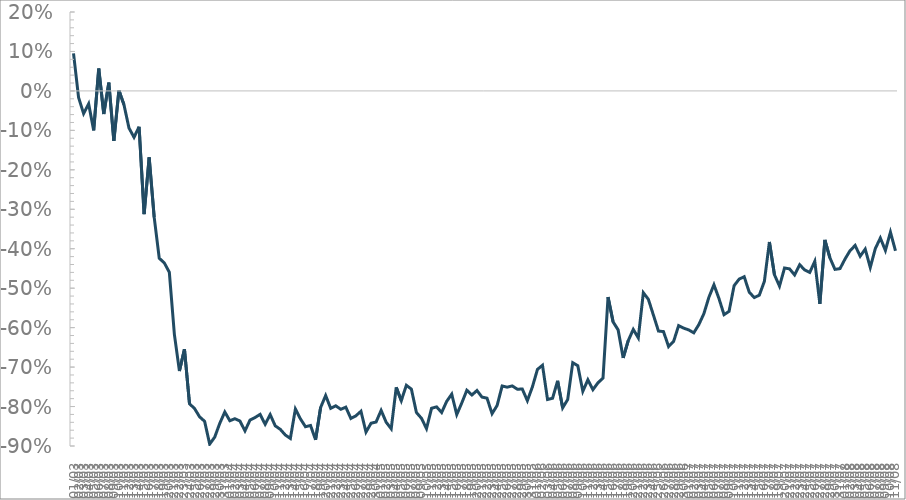
| Category | Series 0 |
|---|---|
| 2020-03-01 | 0.095 |
| 2020-03-02 | -0.017 |
| 2020-03-03 | -0.058 |
| 2020-03-04 | -0.033 |
| 2020-03-05 | -0.1 |
| 2020-03-06 | 0.057 |
| 2020-03-07 | -0.058 |
| 2020-03-08 | 0.021 |
| 2020-03-09 | -0.126 |
| 2020-03-10 | 0.001 |
| 2020-03-11 | -0.035 |
| 2020-03-12 | -0.094 |
| 2020-03-13 | -0.118 |
| 2020-03-14 | -0.091 |
| 2020-03-15 | -0.312 |
| 2020-03-16 | -0.168 |
| 2020-03-17 | -0.321 |
| 2020-03-18 | -0.424 |
| 2020-03-19 | -0.436 |
| 2020-03-20 | -0.46 |
| 2020-03-21 | -0.617 |
| 2020-03-22 | -0.71 |
| 2020-03-23 | -0.655 |
| 2020-03-24 | -0.793 |
| 2020-03-25 | -0.805 |
| 2020-03-26 | -0.826 |
| 2020-03-27 | -0.838 |
| 2020-03-28 | -0.895 |
| 2020-03-29 | -0.878 |
| 2020-03-30 | -0.843 |
| 2020-03-31 | -0.814 |
| 2020-04-01 | -0.836 |
| 2020-04-02 | -0.831 |
| 2020-04-03 | -0.837 |
| 2020-04-04 | -0.862 |
| 2020-04-05 | -0.834 |
| 2020-04-06 | -0.828 |
| 2020-04-07 | -0.82 |
| 2020-04-08 | -0.845 |
| 2020-04-09 | -0.82 |
| 2020-04-10 | -0.849 |
| 2020-04-11 | -0.858 |
| 2020-04-12 | -0.872 |
| 2020-04-13 | -0.881 |
| 2020-04-14 | -0.806 |
| 2020-04-15 | -0.831 |
| 2020-04-16 | -0.851 |
| 2020-04-17 | -0.848 |
| 2020-04-18 | -0.884 |
| 2020-04-19 | -0.802 |
| 2020-04-20 | -0.772 |
| 2020-04-21 | -0.805 |
| 2020-04-22 | -0.798 |
| 2020-04-23 | -0.807 |
| 2020-04-24 | -0.802 |
| 2020-04-25 | -0.83 |
| 2020-04-26 | -0.823 |
| 2020-04-27 | -0.812 |
| 2020-04-28 | -0.865 |
| 2020-04-29 | -0.842 |
| 2020-04-30 | -0.839 |
| 2020-05-01 | -0.81 |
| 2020-05-02 | -0.84 |
| 2020-05-03 | -0.856 |
| 2020-05-04 | -0.751 |
| 2020-05-05 | -0.785 |
| 2020-05-06 | -0.746 |
| 2020-05-07 | -0.756 |
| 2020-05-08 | -0.815 |
| 2020-05-09 | -0.83 |
| 2020-05-10 | -0.856 |
| 2020-05-11 | -0.804 |
| 2020-05-12 | -0.801 |
| 2020-05-13 | -0.815 |
| 2020-05-14 | -0.787 |
| 2020-05-15 | -0.769 |
| 2020-05-16 | -0.82 |
| 2020-05-17 | -0.791 |
| 2020-05-18 | -0.759 |
| 2020-05-19 | -0.771 |
| 2020-05-20 | -0.759 |
| 2020-05-21 | -0.776 |
| 2020-05-22 | -0.779 |
| 2020-05-23 | -0.818 |
| 2020-05-24 | -0.797 |
| 2020-05-25 | -0.748 |
| 2020-05-26 | -0.751 |
| 2020-05-27 | -0.748 |
| 2020-05-28 | -0.756 |
| 2020-05-29 | -0.756 |
| 2020-05-30 | -0.785 |
| 2020-05-31 | -0.75 |
| 2020-06-01 | -0.706 |
| 2020-06-02 | -0.695 |
| 2020-06-03 | -0.782 |
| 2020-06-04 | -0.779 |
| 2020-06-05 | -0.735 |
| 2020-06-06 | -0.803 |
| 2020-06-07 | -0.782 |
| 2020-06-08 | -0.689 |
| 2020-06-09 | -0.696 |
| 2020-06-10 | -0.761 |
| 2020-06-11 | -0.732 |
| 2020-06-12 | -0.757 |
| 2020-06-13 | -0.74 |
| 2020-06-14 | -0.728 |
| 2020-06-15 | -0.523 |
| 2020-06-16 | -0.585 |
| 2020-06-17 | -0.606 |
| 2020-06-18 | -0.677 |
| 2020-06-19 | -0.633 |
| 2020-06-20 | -0.604 |
| 2020-06-21 | -0.626 |
| 2020-06-22 | -0.511 |
| 2020-06-23 | -0.528 |
| 2020-06-24 | -0.568 |
| 2020-06-25 | -0.609 |
| 2020-06-26 | -0.61 |
| 2020-06-27 | -0.648 |
| 2020-06-28 | -0.635 |
| 2020-06-29 | -0.595 |
| 2020-06-30 | -0.601 |
| 2020-07-01 | -0.606 |
| 2020-07-02 | -0.613 |
| 2020-07-03 | -0.592 |
| 2020-07-04 | -0.565 |
| 2020-07-05 | -0.523 |
| 2020-07-06 | -0.491 |
| 2020-07-07 | -0.526 |
| 2020-07-08 | -0.567 |
| 2020-07-09 | -0.559 |
| 2020-07-10 | -0.494 |
| 2020-07-11 | -0.477 |
| 2020-07-12 | -0.471 |
| 2020-07-13 | -0.51 |
| 2020-07-14 | -0.524 |
| 2020-07-15 | -0.518 |
| 2020-07-16 | -0.483 |
| 2020-07-17 | -0.383 |
| 2020-07-18 | -0.466 |
| 2020-07-19 | -0.495 |
| 2020-07-20 | -0.449 |
| 2020-07-21 | -0.451 |
| 2020-07-22 | -0.467 |
| 2020-07-23 | -0.44 |
| 2020-07-24 | -0.454 |
| 2020-07-25 | -0.46 |
| 2020-07-26 | -0.432 |
| 2020-07-27 | -0.54 |
| 2020-07-28 | -0.378 |
| 2020-07-29 | -0.423 |
| 2020-07-30 | -0.452 |
| 2020-07-31 | -0.45 |
| 2020-08-01 | -0.426 |
| 2020-08-02 | -0.405 |
| 2020-08-03 | -0.392 |
| 2020-08-04 | -0.419 |
| 2020-08-05 | -0.401 |
| 2020-08-06 | -0.448 |
| 2020-08-07 | -0.4 |
| 2020-08-08 | -0.373 |
| 2020-08-09 | -0.404 |
| 2020-08-10 | -0.358 |
| 2020-08-11 | -0.405 |